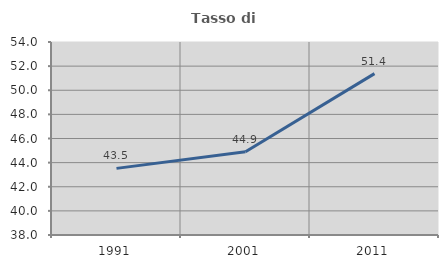
| Category | Tasso di occupazione   |
|---|---|
| 1991.0 | 43.523 |
| 2001.0 | 44.896 |
| 2011.0 | 51.376 |